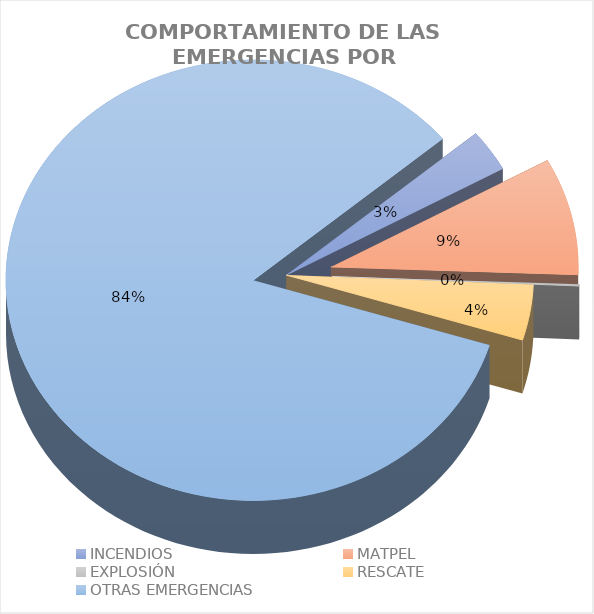
| Category | Incidentes |
|---|---|
| INCENDIOS | 0.031 |
| MATPEL | 0.086 |
| EXPLOSIÓN | 0.001 |
| RESCATE | 0.041 |
| OTRAS EMERGENCIAS | 0.841 |